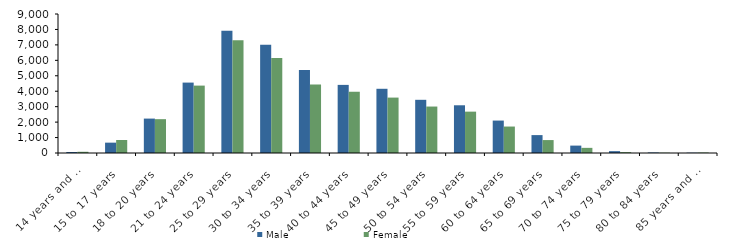
| Category | Male | Female |
|---|---|---|
| 14 years and under | 65 | 79 |
| 15 to 17 years | 670 | 843 |
| 18 to 20 years | 2228 | 2191 |
| 21 to 24 years | 4559 | 4364 |
| 25 to 29 years | 7922 | 7303 |
| 30 to 34 years | 7013 | 6148 |
| 35 to 39 years | 5376 | 4435 |
| 40 to 44 years | 4410 | 3966 |
| 45 to 49 years | 4158 | 3588 |
| 50 to 54 years | 3444 | 3008 |
| 55 to 59 years | 3090 | 2678 |
| 60 to 64 years | 2100 | 1713 |
| 65 to 69 years | 1159 | 837 |
| 70 to 74 years | 479 | 333 |
| 75 to 79 years | 120 | 57 |
| 80 to 84 years | 35 | 19 |
| 85 years and over | 21 | 30 |